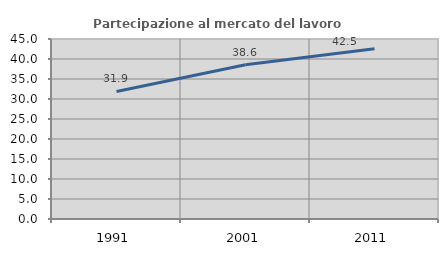
| Category | Partecipazione al mercato del lavoro  femminile |
|---|---|
| 1991.0 | 31.897 |
| 2001.0 | 38.566 |
| 2011.0 | 42.541 |